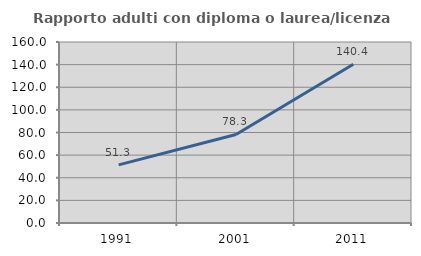
| Category | Rapporto adulti con diploma o laurea/licenza media  |
|---|---|
| 1991.0 | 51.339 |
| 2001.0 | 78.276 |
| 2011.0 | 140.391 |